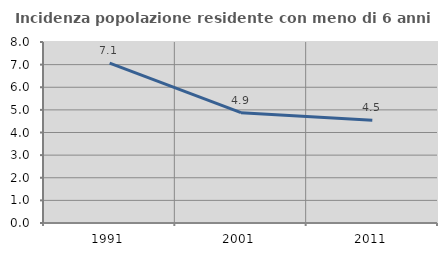
| Category | Incidenza popolazione residente con meno di 6 anni |
|---|---|
| 1991.0 | 7.07 |
| 2001.0 | 4.878 |
| 2011.0 | 4.538 |